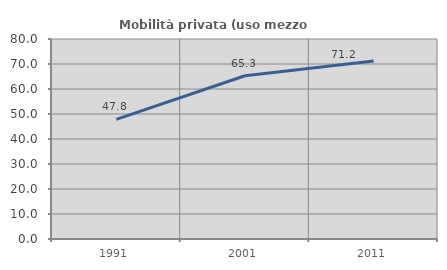
| Category | Mobilità privata (uso mezzo privato) |
|---|---|
| 1991.0 | 47.85 |
| 2001.0 | 65.311 |
| 2011.0 | 71.156 |